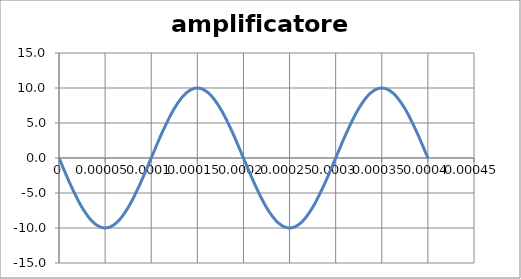
| Category | AVO |
|---|---|
| 0.0 | 0 |
| 1.25e-05 | -3.827 |
| 2.5e-05 | -7.071 |
| 3.7500000000000003e-05 | -9.239 |
| 5e-05 | -10 |
| 6.25e-05 | -9.239 |
| 7.500000000000001e-05 | -7.071 |
| 8.75e-05 | -3.827 |
| 0.0001 | 0 |
| 0.00011250000000000001 | 3.827 |
| 0.000125 | 7.071 |
| 0.0001375 | 9.239 |
| 0.00015000000000000001 | 10 |
| 0.00016250000000000002 | 9.239 |
| 0.000175 | 7.071 |
| 0.0001875 | 3.827 |
| 0.0002 | 0 |
| 0.00021250000000000002 | -3.827 |
| 0.00022500000000000002 | -7.071 |
| 0.0002375 | -9.239 |
| 0.00025 | -10 |
| 0.00026250000000000004 | -9.239 |
| 0.000275 | -7.071 |
| 0.0002875 | -3.827 |
| 0.00030000000000000003 | 0 |
| 0.0003125 | 3.827 |
| 0.00032500000000000004 | 7.071 |
| 0.0003375 | 9.239 |
| 0.00035 | 10 |
| 0.00036250000000000003 | 9.239 |
| 0.000375 | 7.071 |
| 0.00038750000000000004 | 3.827 |
| 0.0004 | 0 |